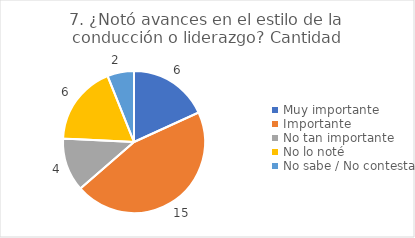
| Category | 7. ¿Notó avances en el estilo de la conducción o liderazgo? |
|---|---|
| Muy importante  | 0.182 |
| Importante  | 0.455 |
| No tan importante  | 0.121 |
| No lo noté  | 0.182 |
| No sabe / No contesta | 0.061 |